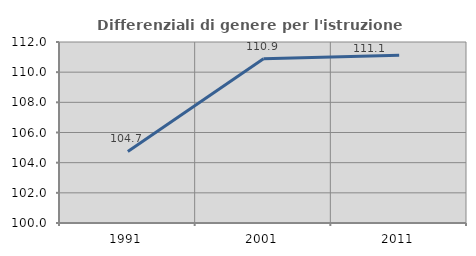
| Category | Differenziali di genere per l'istruzione superiore |
|---|---|
| 1991.0 | 104.746 |
| 2001.0 | 110.885 |
| 2011.0 | 111.123 |